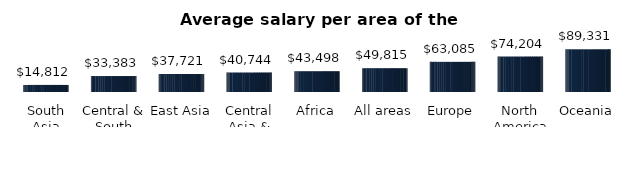
| Category | Average salary per area of the planet |
|---|---|
| South Asia | 14811.799 |
| Central & South America | 33382.774 |
| East Asia | 37721.175 |
| Central Asia & Middle East | 40743.598 |
| Africa | 43498.154 |
| All areas | 49814.598 |
| Europe | 63084.833 |
| North America | 74204.146 |
| Oceania | 89331.056 |